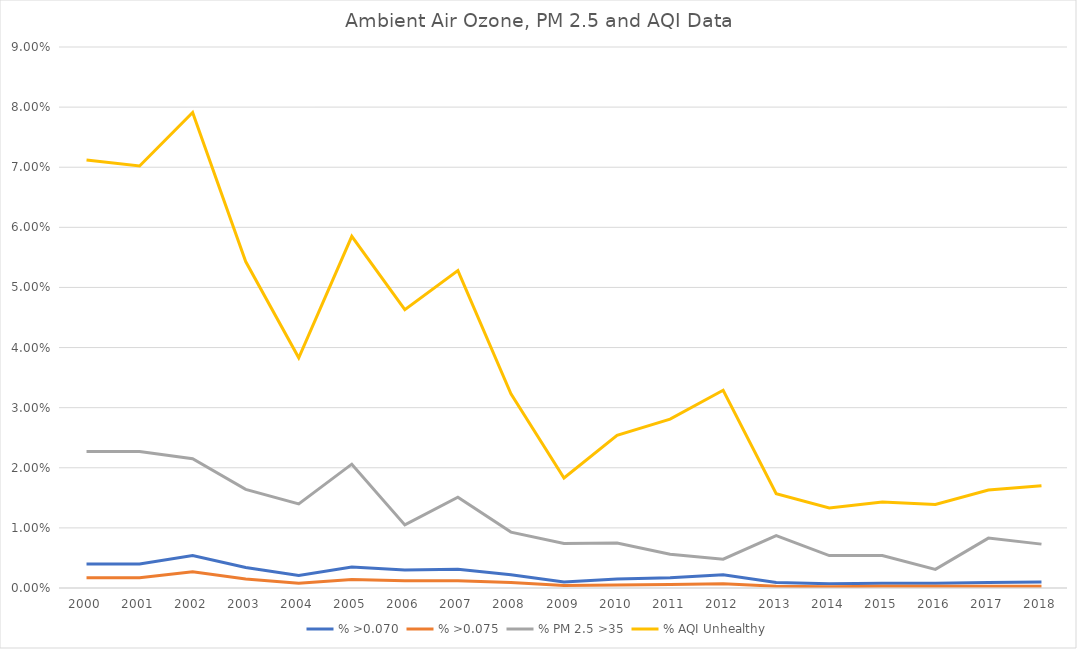
| Category | % >0.070 | % >0.075 | % PM 2.5 >35 | % AQI Unhealthy |
|---|---|---|---|---|
| 2000.0 | 0.004 | 0.002 | 0.023 | 0.071 |
| 2001.0 | 0.004 | 0.002 | 0.023 | 0.07 |
| 2002.0 | 0.005 | 0.003 | 0.022 | 0.079 |
| 2003.0 | 0.003 | 0.002 | 0.016 | 0.054 |
| 2004.0 | 0.002 | 0.001 | 0.014 | 0.038 |
| 2005.0 | 0.004 | 0.001 | 0.021 | 0.058 |
| 2006.0 | 0.003 | 0.001 | 0.01 | 0.046 |
| 2007.0 | 0.003 | 0.001 | 0.015 | 0.053 |
| 2008.0 | 0.002 | 0.001 | 0.009 | 0.032 |
| 2009.0 | 0.001 | 0 | 0.007 | 0.018 |
| 2010.0 | 0.002 | 0 | 0.008 | 0.025 |
| 2011.0 | 0.002 | 0.001 | 0.006 | 0.028 |
| 2012.0 | 0.002 | 0.001 | 0.005 | 0.033 |
| 2013.0 | 0.001 | 0 | 0.009 | 0.016 |
| 2014.0 | 0.001 | 0 | 0.005 | 0.013 |
| 2015.0 | 0.001 | 0 | 0.005 | 0.014 |
| 2016.0 | 0.001 | 0 | 0.003 | 0.014 |
| 2017.0 | 0.001 | 0 | 0.008 | 0.016 |
| 2018.0 | 0.001 | 0 | 0.007 | 0.017 |